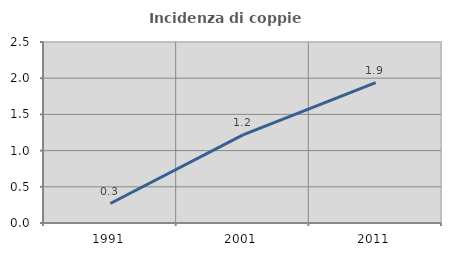
| Category | Incidenza di coppie miste |
|---|---|
| 1991.0 | 0.269 |
| 2001.0 | 1.217 |
| 2011.0 | 1.938 |